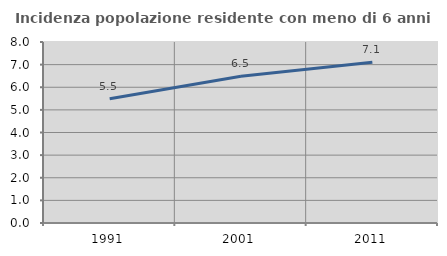
| Category | Incidenza popolazione residente con meno di 6 anni |
|---|---|
| 1991.0 | 5.491 |
| 2001.0 | 6.491 |
| 2011.0 | 7.1 |